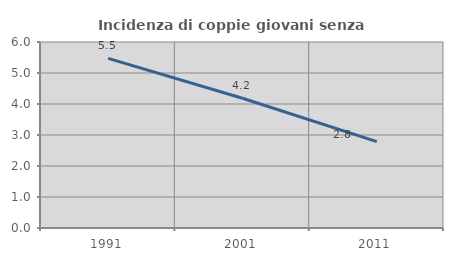
| Category | Incidenza di coppie giovani senza figli |
|---|---|
| 1991.0 | 5.47 |
| 2001.0 | 4.187 |
| 2011.0 | 2.785 |